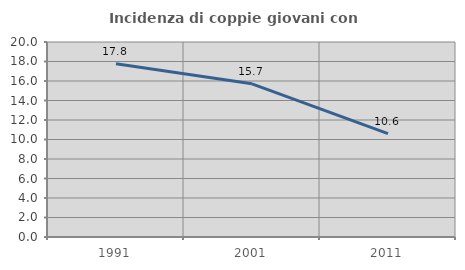
| Category | Incidenza di coppie giovani con figli |
|---|---|
| 1991.0 | 17.77 |
| 2001.0 | 15.714 |
| 2011.0 | 10.593 |